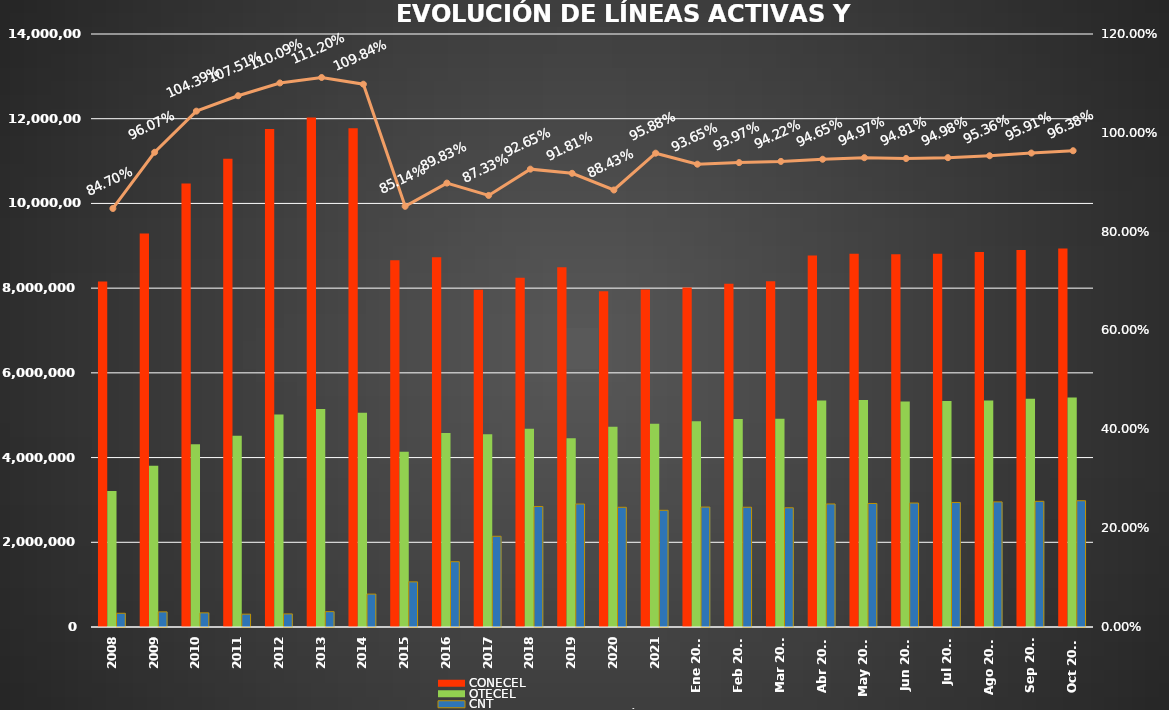
| Category | CONECEL | OTECEL | CNT |
|---|---|---|---|
| 2008 | 8156359 | 3211922 | 323967 |
| 2009 | 9291268 | 3806432 | 356900 |
| 2010 | 10470502 | 4314599 | 333730 |
| 2011 | 11057316 | 4513874 | 303368 |
| 2012 | 11757906 | 5019686 | 309271 |
| 2013 | 12030886 | 5148308 | 362560 |
| 2014 | 11772020 | 5055645 | 776892 |
| 2015 | 8658619 | 4134698 | 1065703 |
| 2016 | 8726823 | 4580092 | 1541219 |
| 2017 | 7960263 | 4549024 | 2142117 |
| 2018 | 8248050 | 4679646 | 2845142 |
| 2019 | 8493054 | 4456356 | 2903690 |
| 2020 | 7929253 | 4729725 | 2826388 |
| 2021 | 7965274 | 4800608 | 2755177 |
| Ene 2022 | 8012894 | 4856877 | 2831764 |
| Feb 2022 | 8103873 | 4909433 | 2827246 |
| Mar 2022 | 8163884 | 4915830 | 2814894 |
| Abr 2022 | 8773356 | 5349789 | 2904652 |
| May 2022 | 8810418 | 5358332 | 2916052 |
| Jun 2022 | 8802391 | 5326606 | 2926942 |
| Jul 2022 | 8811432 | 5334228 | 2940353 |
| Ago 2022 | 8855909 | 5345771 | 2954002 |
| Sep 2022 | 8900276 | 5386355 | 2967003 |
| Oct 2022 | 8938600 | 5418229 | 2980969 |